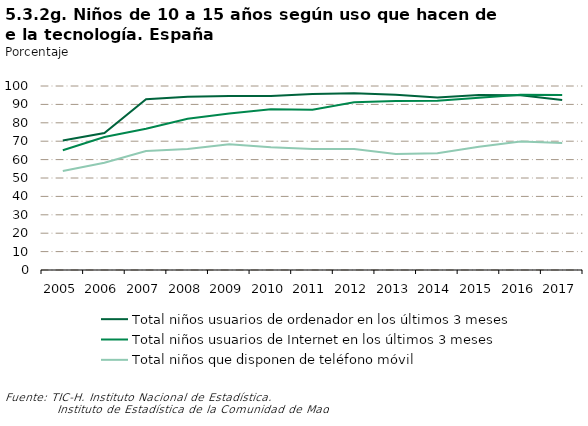
| Category | Total niños usuarios de ordenador en los últimos 3 meses | Total niños usuarios de Internet en los últimos 3 meses | Total niños que disponen de teléfono móvil |
|---|---|---|---|
| 2005.0 | 70.4 | 65.1 | 53.8 |
| 2006.0 | 74.4 | 72.3 | 58.3 |
| 2007.0 | 92.8 | 76.8 | 64.7 |
| 2008.0 | 94.1 | 82.2 | 65.8 |
| 2009.0 | 94.5 | 85.1 | 68.4 |
| 2010.0 | 94.6 | 87.3 | 66.7 |
| 2011.0 | 95.6 | 87.1 | 65.8 |
| 2012.0 | 96.029 | 91.165 | 65.79 |
| 2013.0 | 95.2 | 91.8 | 63 |
| 2014.0 | 93.779 | 91.981 | 63.511 |
| 2015.0 | 95.104 | 93.57 | 67.01 |
| 2016.0 | 94.934 | 95.207 | 69.803 |
| 2017.0 | 92.441 | 95.068 | 69.084 |